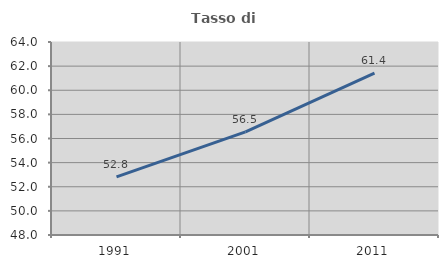
| Category | Tasso di occupazione   |
|---|---|
| 1991.0 | 52.813 |
| 2001.0 | 56.544 |
| 2011.0 | 61.42 |